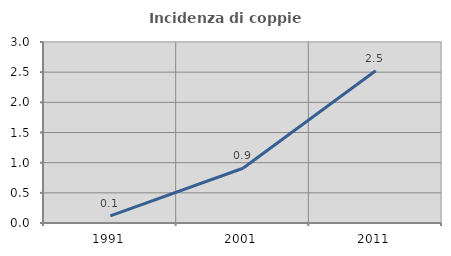
| Category | Incidenza di coppie miste |
|---|---|
| 1991.0 | 0.117 |
| 2001.0 | 0.907 |
| 2011.0 | 2.524 |